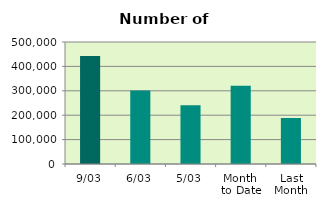
| Category | Series 0 |
|---|---|
| 9/03 | 442402 |
| 6/03 | 301278 |
| 5/03 | 240442 |
| Month 
to Date | 320328 |
| Last
Month | 188783.7 |